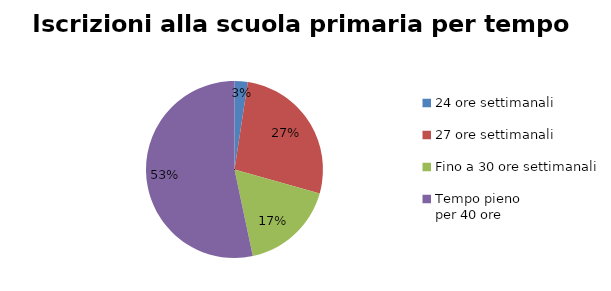
| Category | Series 0 |
|---|---|
| 24 ore settimanali | 892 |
| 27 ore settimanali | 9998 |
| Fino a 30 ore settimanali | 6413 |
| Tempo pieno 
per 40 ore | 19762 |